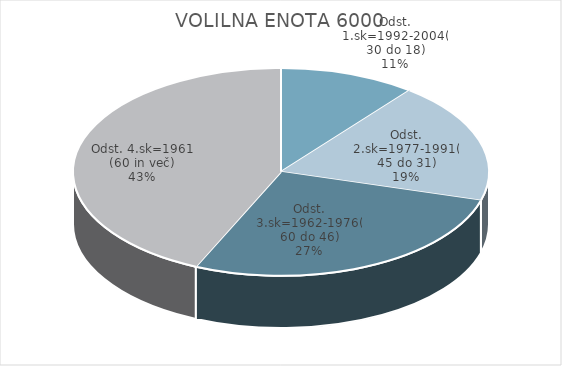
| Category | VOLILNA ENOTA 6000 |
|---|---|
| Odst. 1.sk=1992-2004(30 do 18) | 4.35 |
| Odst. 2.sk=1977-1991(45 do 31) | 7.73 |
| Odst. 3.sk=1962-1976(60 do 46) | 11.17 |
| Odst. 4.sk=1961 (60 in več) | 17.75 |